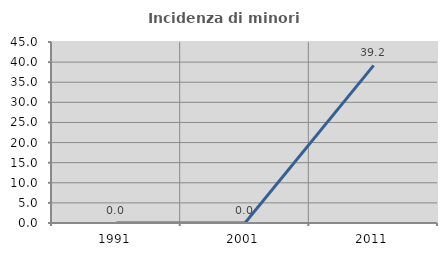
| Category | Incidenza di minori stranieri |
|---|---|
| 1991.0 | 0 |
| 2001.0 | 0 |
| 2011.0 | 39.189 |